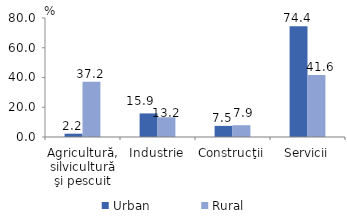
| Category | Urban | Rural |
|---|---|---|
| Agricultură, silvicultură şi pescuit | 2.238 | 37.196 |
| Industrie | 15.854 | 13.247 |
| Construcţii | 7.478 | 7.924 |
| Servicii | 74.43 | 41.634 |